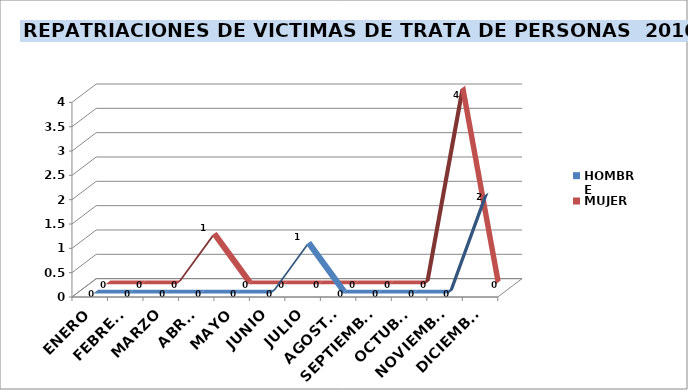
| Category | HOMBRE | MUJER |
|---|---|---|
| ENERO | 0 | 0 |
| FEBRERO | 0 | 0 |
| MARZO | 0 | 0 |
| ABRIL | 0 | 1 |
| MAYO | 0 | 0 |
| JUNIO | 0 | 0 |
| JULIO | 1 | 0 |
| AGOSTO | 0 | 0 |
| SEPTIEMBRE | 0 | 0 |
| OCTUBRE | 0 | 0 |
| NOVIEMBRE | 0 | 4 |
| DICIEMBRE | 2 | 0 |